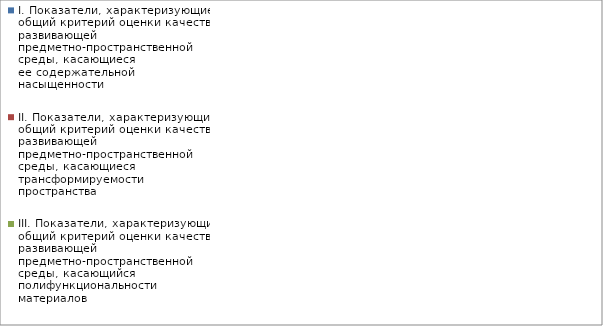
| Category | I. Показатели, характеризующие общий критерий оценки качества развивающей предметно-пространственной среды, касающиеся ее содержательной насыщенности | II. Показатели, характеризующие общий критерий оценки качества развивающей предметно-пространственной среды, касающиеся трансформируемости пространства | III. Показатели, характеризующие общий критерий оценки качества развивающей предметно-пространственной среды, касающийся полифункциональности материалов | IV. Показатели, характеризующие общий критерий оценки качества развивающей предметно-пространственной среды, касающиеся ее вариативности | V. Показатели, характеризующие общий критерий оценки качества развивающей предметно-пространственной среды, касающиеся ее доступности | VI. Показатели, характеризующие общий критерий оценки качества развивающей предметно-пространственной среды, касающиеся безопасности предметно-пространственной среды |
|---|---|---|---|---|---|---|
| Ромашка | 0.909 | 0.667 | 0.667 | 0.833 | 0.9 | 0.85 |